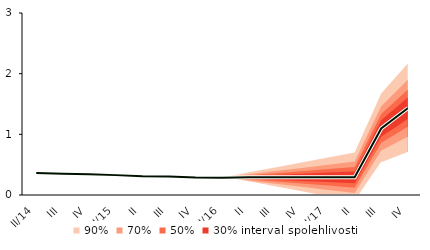
| Category | linka | Centerline |
|---|---|---|
| II/14 | 0.363 | 0.363 |
| III | 0.35 | 0.35 |
| IV | 0.344 | 0.344 |
| I/15 | 0.328 | 0.328 |
| II | 0.31 | 0.31 |
| III | 0.306 | 0.306 |
| IV | 0.29 | 0.29 |
| I/16 | 0.286 | 0.286 |
| II | 0.291 | 0.291 |
| III | 0.291 | 0.291 |
| IV | 0.291 | 0.291 |
| I/17 | 0.291 | 0.291 |
| II | 0.291 | 0.291 |
| III | 1.097 | 1.097 |
| IV | 1.43 | 1.43 |